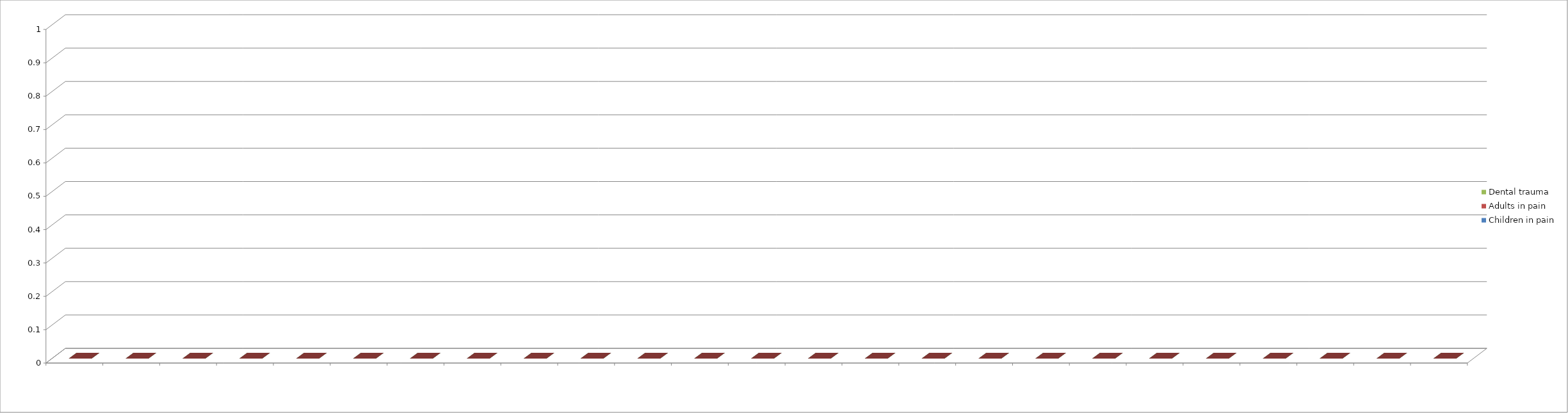
| Category | Children in pain | Adults in pain | Dental trauma |
|---|---|---|---|
| 0 | 0 | 0 | 0 |
| 1 | 0 | 0 | 0 |
| 2 | 0 | 0 | 0 |
| 3 | 0 | 0 | 0 |
| 4 | 0 | 0 | 0 |
| 5 | 0 | 0 | 0 |
| 6 | 0 | 0 | 0 |
| 7 | 0 | 0 | 0 |
| 8 | 0 | 0 | 0 |
| 9 | 0 | 0 | 0 |
| 10 | 0 | 0 | 0 |
| 11 | 0 | 0 | 0 |
| 12 | 0 | 0 | 0 |
| 13 | 0 | 0 | 0 |
| 14 | 0 | 0 | 0 |
| 15 | 0 | 0 | 0 |
| 16 | 0 | 0 | 0 |
| 17 | 0 | 0 | 0 |
| 18 | 0 | 0 | 0 |
| 19 | 0 | 0 | 0 |
| 20 | 0 | 0 | 0 |
| 21 | 0 | 0 | 0 |
| 22 | 0 | 0 | 0 |
| 23 | 0 | 0 | 0 |
| 24 | 0 | 0 | 0 |